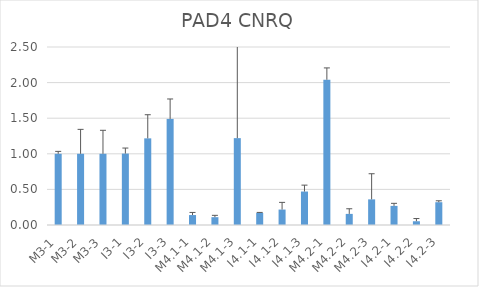
| Category | PAD4 CNRQ |
|---|---|
| M3-1 | 1 |
| M3-2 | 1 |
| M3-3 | 1 |
| I3-1 | 1.003 |
| I3-2 | 1.217 |
| I3-3 | 1.49 |
| M4.1-1 | 0.14 |
| M4.1-2 | 0.11 |
| M4.1-3 | 1.22 |
| I4.1-1 | 0.169 |
| I4.1-2 | 0.217 |
| I4.1-3 | 0.47 |
| M4.2-1 | 2.04 |
| M4.2-2 | 0.156 |
| M4.2-3 | 0.36 |
| I4.2-1 | 0.268 |
| I4.2-2 | 0.053 |
| I4.2-3 | 0.32 |